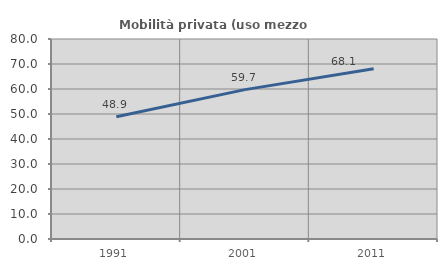
| Category | Mobilità privata (uso mezzo privato) |
|---|---|
| 1991.0 | 48.864 |
| 2001.0 | 59.748 |
| 2011.0 | 68.11 |